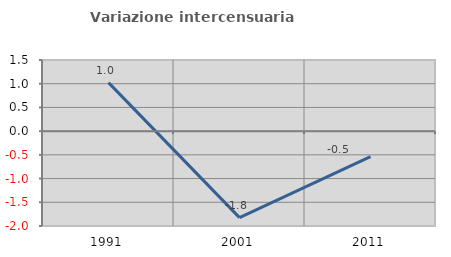
| Category | Variazione intercensuaria annua |
|---|---|
| 1991.0 | 1.023 |
| 2001.0 | -1.823 |
| 2011.0 | -0.538 |